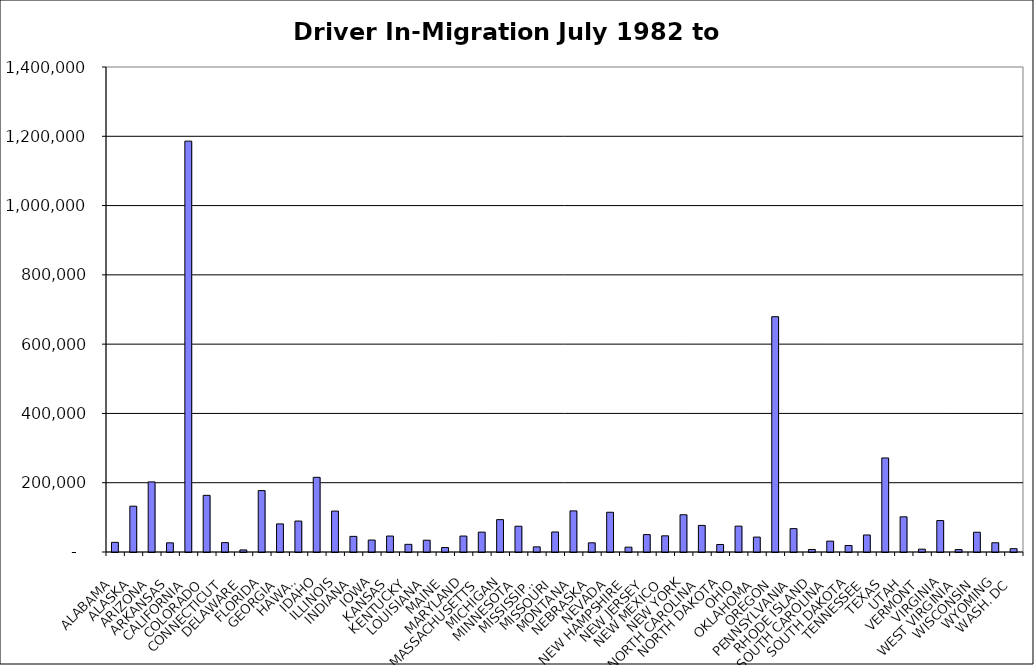
| Category | Series 0 |
|---|---|
| ALABAMA | 27906.5 |
| ALASKA | 132240.5 |
| ARIZONA | 202343 |
| ARKANSAS | 26455.5 |
| CALIFORNIA | 1186017.5 |
| COLORADO | 163547 |
| CONNECTICUT | 27074 |
| DELAWARE | 5972.5 |
| FLORIDA | 177277 |
| GEORGIA | 81133 |
| HAWAII | 89360.5 |
| IDAHO | 215525.5 |
| ILLINOIS | 118112.5 |
| INDIANA | 45147 |
| IOWA | 34521.5 |
| KANSAS | 46066.5 |
| KENTUCKY | 22103 |
| LOUISIANA | 33975.5 |
| MAINE | 12823.5 |
| MARYLAND | 46032 |
| MASSACHUSETTS | 57290 |
| MICHIGAN | 93427 |
| MINNESOTA | 74333.5 |
| MISSISSIPPI | 14802 |
| MISSOURI | 57753 |
| MONTANA | 118658 |
| NEBRASKA | 26487.5 |
| NEVADA | 114699 |
| NEW HAMPSHIRE | 13964.5 |
| NEW JERSEY | 50233 |
| NEW MEXICO | 46645 |
| NEW YORK | 107445 |
| NORTH CAROLINA | 76778.5 |
| NORTH DAKOTA | 21713.5 |
| OHIO | 74601.5 |
| OKLAHOMA | 42992 |
| OREGON | 679288 |
| PENNSYLVANIA | 67420.5 |
| RHODE ISLAND | 7331 |
| SOUTH CAROLINA | 31388.5 |
| SOUTH DAKOTA | 18776.5 |
| TENNESSEE | 49147.5 |
| TEXAS | 271461 |
| UTAH | 101498.5 |
| VERMONT | 8210 |
| VIRGINIA | 90735 |
| WEST VIRGINIA | 6928.5 |
| WISCONSIN | 57078.5 |
| WYOMING | 26678 |
| WASH. DC | 9571 |